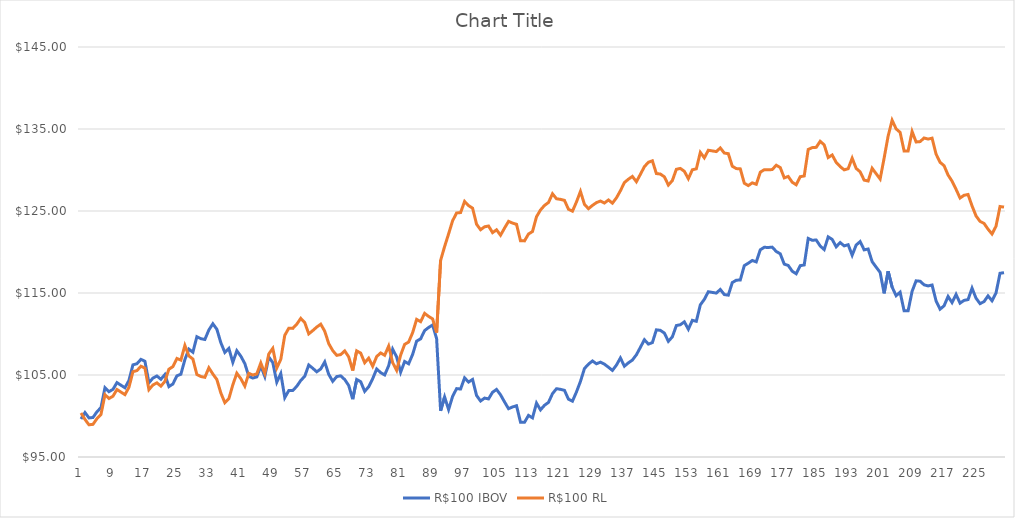
| Category | R$100 IBOV | R$100 RL |
|---|---|---|
| 0 | 99.636 | 100.364 |
| 1 | 100.419 | 99.581 |
| 2 | 99.765 | 98.927 |
| 3 | 99.821 | 98.984 |
| 4 | 100.521 | 99.684 |
| 5 | 101.027 | 100.19 |
| 6 | 103.442 | 102.604 |
| 7 | 102.969 | 102.132 |
| 8 | 103.251 | 102.413 |
| 9 | 104.07 | 103.233 |
| 10 | 103.753 | 102.916 |
| 11 | 103.443 | 102.606 |
| 12 | 104.334 | 103.497 |
| 13 | 106.237 | 105.4 |
| 14 | 106.376 | 105.539 |
| 15 | 106.909 | 106.072 |
| 16 | 106.672 | 105.835 |
| 17 | 104.049 | 103.212 |
| 18 | 104.623 | 103.785 |
| 19 | 104.878 | 104.041 |
| 20 | 104.48 | 103.643 |
| 21 | 105.062 | 104.225 |
| 22 | 103.583 | 105.704 |
| 23 | 103.905 | 106.026 |
| 24 | 104.895 | 107.017 |
| 25 | 105.096 | 106.817 |
| 26 | 106.881 | 108.602 |
| 27 | 108.156 | 107.327 |
| 28 | 107.775 | 106.946 |
| 29 | 109.669 | 105.053 |
| 30 | 109.43 | 104.815 |
| 31 | 109.333 | 104.718 |
| 32 | 110.492 | 105.876 |
| 33 | 111.249 | 105.119 |
| 34 | 110.58 | 104.45 |
| 35 | 108.934 | 102.804 |
| 36 | 107.749 | 101.62 |
| 37 | 108.24 | 102.11 |
| 38 | 106.547 | 103.803 |
| 39 | 107.961 | 105.217 |
| 40 | 107.295 | 104.55 |
| 41 | 106.392 | 103.647 |
| 42 | 104.834 | 105.205 |
| 43 | 104.629 | 105 |
| 44 | 104.768 | 105.139 |
| 45 | 106.096 | 106.467 |
| 46 | 104.822 | 105.193 |
| 47 | 107.196 | 107.567 |
| 48 | 106.514 | 108.249 |
| 49 | 104.122 | 105.858 |
| 50 | 105.172 | 106.908 |
| 51 | 102.238 | 109.842 |
| 52 | 103.097 | 110.701 |
| 53 | 103.112 | 110.686 |
| 54 | 103.621 | 111.194 |
| 55 | 104.332 | 111.905 |
| 56 | 104.848 | 111.389 |
| 57 | 106.222 | 110.015 |
| 58 | 105.822 | 110.415 |
| 59 | 105.39 | 110.847 |
| 60 | 105.739 | 111.196 |
| 61 | 106.595 | 110.341 |
| 62 | 105.084 | 108.829 |
| 63 | 104.231 | 107.977 |
| 64 | 104.807 | 107.401 |
| 65 | 104.896 | 107.489 |
| 66 | 104.447 | 107.938 |
| 67 | 103.72 | 107.211 |
| 68 | 102.052 | 105.542 |
| 69 | 104.453 | 107.944 |
| 70 | 104.18 | 107.67 |
| 71 | 103.008 | 106.498 |
| 72 | 103.566 | 107.057 |
| 73 | 104.551 | 106.072 |
| 74 | 105.73 | 107.25 |
| 75 | 105.291 | 107.689 |
| 76 | 105.006 | 107.404 |
| 77 | 106.128 | 108.527 |
| 78 | 108.145 | 106.51 |
| 79 | 107.204 | 105.569 |
| 80 | 105.341 | 107.431 |
| 81 | 106.647 | 108.737 |
| 82 | 106.367 | 109.017 |
| 83 | 107.515 | 110.165 |
| 84 | 109.132 | 111.782 |
| 85 | 109.411 | 111.503 |
| 86 | 110.424 | 112.516 |
| 87 | 110.793 | 112.146 |
| 88 | 111.1 | 111.84 |
| 89 | 109.434 | 110.174 |
| 90 | 100.635 | 118.973 |
| 91 | 102.327 | 120.665 |
| 92 | 100.785 | 122.207 |
| 93 | 102.388 | 123.811 |
| 94 | 103.338 | 124.76 |
| 95 | 103.29 | 124.808 |
| 96 | 104.647 | 126.165 |
| 97 | 104.142 | 125.659 |
| 98 | 104.457 | 125.344 |
| 99 | 102.501 | 123.388 |
| 100 | 101.828 | 122.715 |
| 101 | 102.185 | 123.072 |
| 102 | 102.087 | 123.169 |
| 103 | 102.896 | 122.361 |
| 104 | 103.239 | 122.704 |
| 105 | 102.582 | 122.047 |
| 106 | 101.713 | 122.915 |
| 107 | 100.892 | 123.737 |
| 108 | 101.101 | 123.527 |
| 109 | 101.253 | 123.375 |
| 110 | 99.241 | 121.363 |
| 111 | 99.234 | 121.356 |
| 112 | 100.073 | 122.196 |
| 113 | 99.771 | 122.498 |
| 114 | 101.574 | 124.3 |
| 115 | 100.749 | 125.125 |
| 116 | 101.305 | 125.681 |
| 117 | 101.661 | 126.037 |
| 118 | 102.723 | 127.099 |
| 119 | 103.328 | 126.495 |
| 120 | 103.252 | 126.419 |
| 121 | 103.128 | 126.296 |
| 122 | 102.045 | 125.213 |
| 123 | 101.808 | 124.976 |
| 124 | 102.936 | 126.104 |
| 125 | 104.217 | 127.385 |
| 126 | 105.79 | 125.812 |
| 127 | 106.317 | 125.284 |
| 128 | 106.713 | 125.68 |
| 129 | 106.371 | 126.022 |
| 130 | 106.564 | 126.216 |
| 131 | 106.322 | 125.974 |
| 132 | 105.951 | 126.345 |
| 133 | 105.56 | 125.954 |
| 134 | 106.203 | 126.597 |
| 135 | 107.075 | 127.47 |
| 136 | 106.075 | 128.47 |
| 137 | 106.484 | 128.879 |
| 138 | 106.821 | 129.216 |
| 139 | 107.467 | 128.57 |
| 140 | 108.371 | 129.475 |
| 141 | 109.303 | 130.407 |
| 142 | 108.768 | 130.941 |
| 143 | 108.95 | 131.123 |
| 144 | 110.507 | 129.565 |
| 145 | 110.447 | 129.505 |
| 146 | 110.111 | 129.169 |
| 147 | 109.108 | 128.165 |
| 148 | 109.655 | 128.713 |
| 149 | 111.03 | 130.088 |
| 150 | 111.133 | 130.19 |
| 151 | 111.482 | 129.841 |
| 152 | 110.583 | 128.941 |
| 153 | 111.668 | 130.027 |
| 154 | 111.552 | 130.143 |
| 155 | 113.557 | 132.148 |
| 156 | 114.224 | 131.481 |
| 157 | 115.153 | 132.411 |
| 158 | 115.07 | 132.328 |
| 159 | 114.99 | 132.247 |
| 160 | 115.431 | 132.688 |
| 161 | 114.808 | 132.066 |
| 162 | 114.736 | 131.994 |
| 163 | 116.272 | 130.458 |
| 164 | 116.559 | 130.171 |
| 165 | 116.589 | 130.141 |
| 166 | 118.337 | 128.393 |
| 167 | 118.633 | 128.097 |
| 168 | 118.967 | 128.431 |
| 169 | 118.792 | 128.256 |
| 170 | 120.265 | 129.729 |
| 171 | 120.573 | 130.037 |
| 172 | 120.552 | 130.016 |
| 173 | 120.591 | 130.055 |
| 174 | 120.065 | 130.582 |
| 175 | 119.782 | 130.299 |
| 176 | 118.526 | 129.043 |
| 177 | 118.359 | 129.209 |
| 178 | 117.657 | 128.507 |
| 179 | 117.345 | 128.195 |
| 180 | 118.333 | 129.183 |
| 181 | 118.422 | 129.272 |
| 182 | 121.654 | 132.504 |
| 183 | 121.43 | 132.728 |
| 184 | 121.465 | 132.763 |
| 185 | 120.73 | 133.498 |
| 186 | 120.299 | 133.067 |
| 187 | 121.844 | 131.522 |
| 188 | 121.536 | 131.83 |
| 189 | 120.637 | 130.931 |
| 190 | 121.149 | 130.419 |
| 191 | 120.747 | 130.017 |
| 192 | 120.888 | 130.159 |
| 193 | 119.608 | 131.439 |
| 194 | 120.851 | 130.196 |
| 195 | 121.271 | 129.776 |
| 196 | 120.26 | 128.765 |
| 197 | 120.366 | 128.66 |
| 198 | 118.818 | 130.208 |
| 199 | 118.16 | 129.55 |
| 200 | 117.509 | 128.899 |
| 201 | 114.957 | 131.45 |
| 202 | 117.647 | 134.14 |
| 203 | 115.722 | 136.066 |
| 204 | 114.673 | 135.017 |
| 205 | 115.101 | 134.589 |
| 206 | 112.827 | 132.315 |
| 207 | 112.827 | 132.315 |
| 208 | 115.206 | 134.694 |
| 209 | 116.482 | 133.418 |
| 210 | 116.439 | 133.461 |
| 211 | 115.996 | 133.904 |
| 212 | 115.864 | 133.772 |
| 213 | 115.973 | 133.881 |
| 214 | 114.031 | 131.939 |
| 215 | 113.028 | 130.936 |
| 216 | 113.435 | 130.529 |
| 217 | 114.578 | 129.386 |
| 218 | 113.834 | 128.642 |
| 219 | 114.829 | 127.647 |
| 220 | 113.763 | 126.581 |
| 221 | 114.101 | 126.919 |
| 222 | 114.195 | 127.012 |
| 223 | 115.587 | 125.619 |
| 224 | 114.368 | 124.4 |
| 225 | 113.703 | 123.735 |
| 226 | 113.95 | 123.488 |
| 227 | 114.648 | 122.789 |
| 228 | 114.053 | 122.195 |
| 229 | 114.999 | 123.14 |
| 230 | 117.406 | 125.547 |
| 231 | 117.478 | 125.475 |